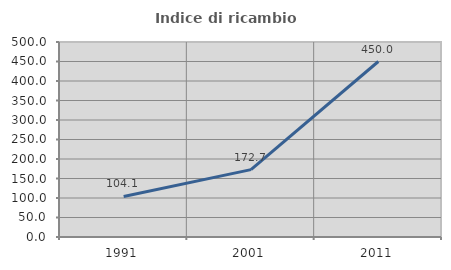
| Category | Indice di ricambio occupazionale  |
|---|---|
| 1991.0 | 104.054 |
| 2001.0 | 172.727 |
| 2011.0 | 450 |